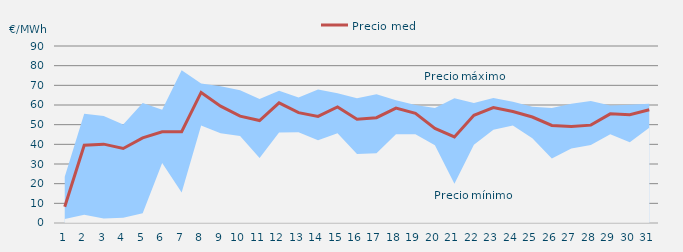
| Category | Precio medio |
|---|---|
| 1.0 | 8.268 |
| 2.0 | 39.529 |
| 3.0 | 40.098 |
| 4.0 | 37.903 |
| 5.0 | 43.29 |
| 6.0 | 46.391 |
| 7.0 | 46.428 |
| 8.0 | 66.398 |
| 9.0 | 59.439 |
| 10.0 | 54.362 |
| 11.0 | 52.097 |
| 12.0 | 61.056 |
| 13.0 | 56.096 |
| 14.0 | 54.183 |
| 15.0 | 59.032 |
| 16.0 | 52.713 |
| 17.0 | 53.558 |
| 18.0 | 58.429 |
| 19.0 | 55.802 |
| 20.0 | 48.096 |
| 21.0 | 43.748 |
| 22.0 | 54.754 |
| 23.0 | 58.652 |
| 24.0 | 56.668 |
| 25.0 | 53.896 |
| 26.0 | 49.613 |
| 27.0 | 49.132 |
| 28.0 | 49.756 |
| 29.0 | 55.502 |
| 30.0 | 55.106 |
| 31.0 | 57.598 |